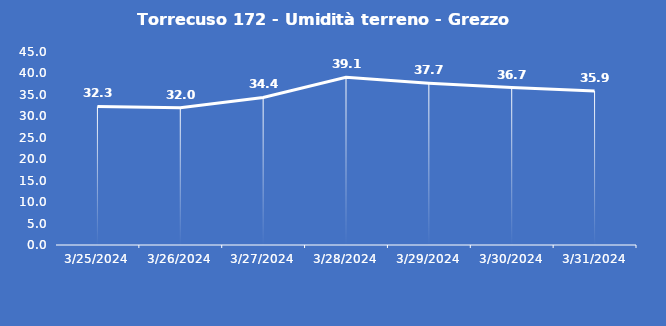
| Category | Torrecuso 172 - Umidità terreno - Grezzo (%VWC) |
|---|---|
| 3/25/24 | 32.3 |
| 3/26/24 | 32 |
| 3/27/24 | 34.4 |
| 3/28/24 | 39.1 |
| 3/29/24 | 37.7 |
| 3/30/24 | 36.7 |
| 3/31/24 | 35.9 |